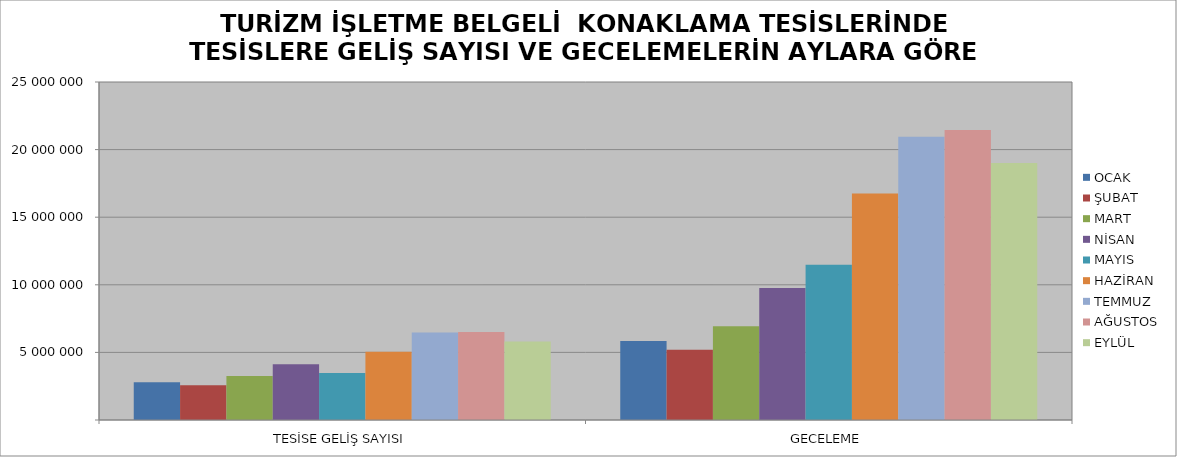
| Category | OCAK | ŞUBAT | MART | NİSAN | MAYIS | HAZİRAN | TEMMUZ | AĞUSTOS | EYLÜL |
|---|---|---|---|---|---|---|---|---|---|
| TESİSE GELİŞ SAYISI | 2792196 | 2573999 | 3258929 | 4119434 | 3468117 | 5043280 | 6471045 | 6513976 | 5800131 |
| GECELEME | 5837753 | 5199578 | 6939659 | 9767435 | 11484758 | 16745602 | 20944829 | 21446796 | 19007595 |